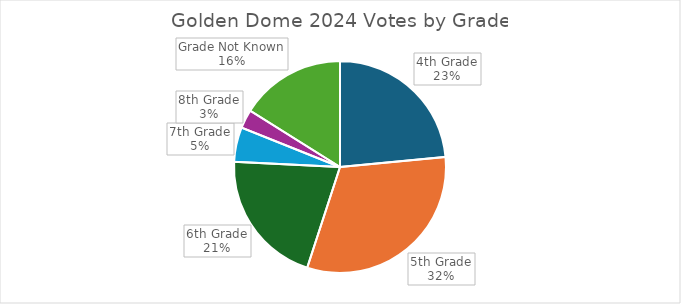
| Category | Votes |
|---|---|
| 4th Grade | 321 |
| 5th Grade | 431 |
| 6th Grade | 284 |
| 7th Grade | 72 |
| 8th Grade | 39 |
| Grade Not Known | 220 |